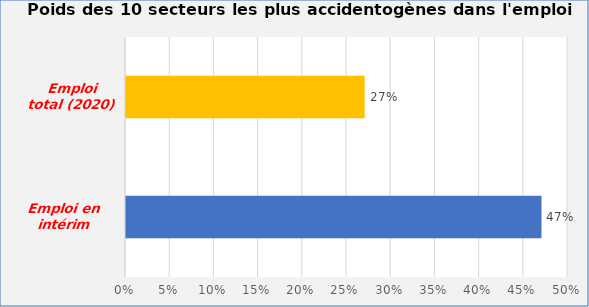
| Category | Series 0 |
|---|---|
| Emploi en intérim (2021) | 0.47 |
| Emploi total (2020) | 0.27 |